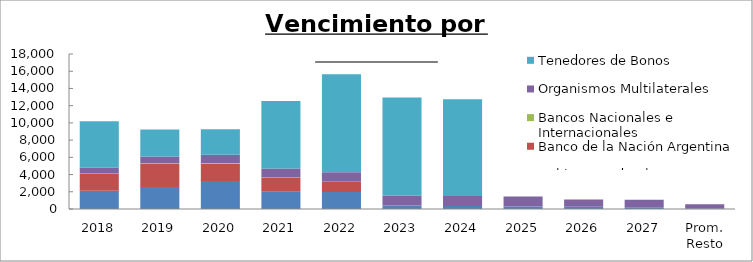
| Category | Gobierno Federal | Banco de la Nación Argentina | Bancos Nacionales e Internacionales | Organismos Multilaterales | Tenedores de Bonos |
|---|---|---|---|---|---|
| 2018 | 2108.956 | 1973.524 | 48.424 | 682.102 | 5379.715 |
| 2019 | 2552.907 | 2701.887 | 64.09 | 781.723 | 3133.612 |
| 2020 | 3258.601 | 2009.858 | 73.145 | 951.836 | 2963.21 |
| 2021 | 2017.49 | 1631.222 | 39.21 | 1027.794 | 7817.459 |
| 2022 | 1961.62 | 1226.438 | 0 | 1085.837 | 11382.935 |
| 2023 | 409.659 | 0 | 0 | 1127.1 | 11418.71 |
| 2024 | 342.034 | 0 | 0 | 1166.032 | 11239.209 |
| 2025 | 282.494 | 0 | 0 | 1169.72 | 0 |
| 2026 | 250.723 | 0 | 0 | 850.966 | 0 |
| 2027 | 216.957 | 0 | 0 | 860.826 | 0 |
| Prom. Resto | 40.703 | 0 | 0 | 513.658 | 0 |